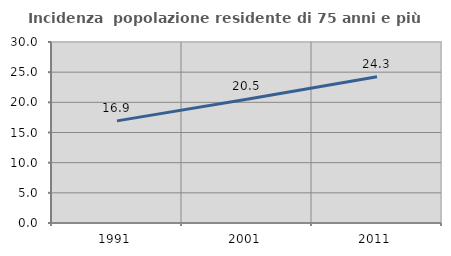
| Category | Incidenza  popolazione residente di 75 anni e più |
|---|---|
| 1991.0 | 16.927 |
| 2001.0 | 20.494 |
| 2011.0 | 24.252 |